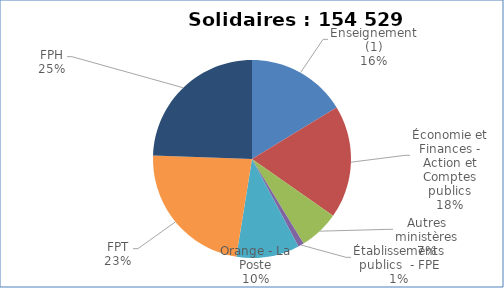
| Category | Nombre de voix |
|---|---|
| Enseignement (1) | 25190 |
| Économie et Finances - Action et Comptes publics | 28470.1 |
| Autres ministères | 10131.3 |
| Établissements publics  - FPE | 1465 |
| Orange - La Poste | 15936 |
| FPT | 35586 |
| FPH | 37750.5 |